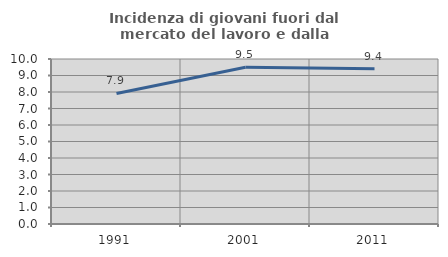
| Category | Incidenza di giovani fuori dal mercato del lavoro e dalla formazione  |
|---|---|
| 1991.0 | 7.914 |
| 2001.0 | 9.501 |
| 2011.0 | 9.402 |